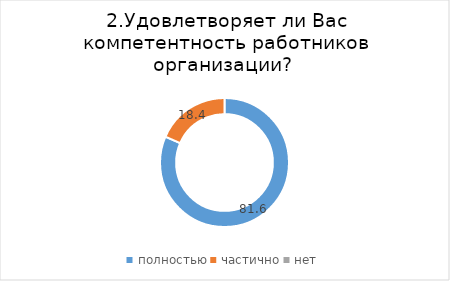
| Category | Series 0 |
|---|---|
| полностью | 81.56 |
| частично | 18.44 |
| нет | 0 |